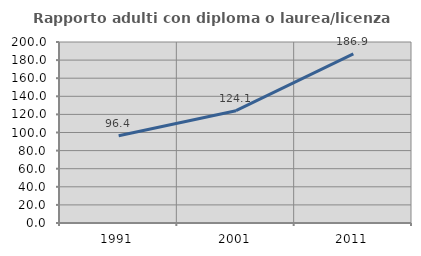
| Category | Rapporto adulti con diploma o laurea/licenza media  |
|---|---|
| 1991.0 | 96.4 |
| 2001.0 | 124.067 |
| 2011.0 | 186.88 |